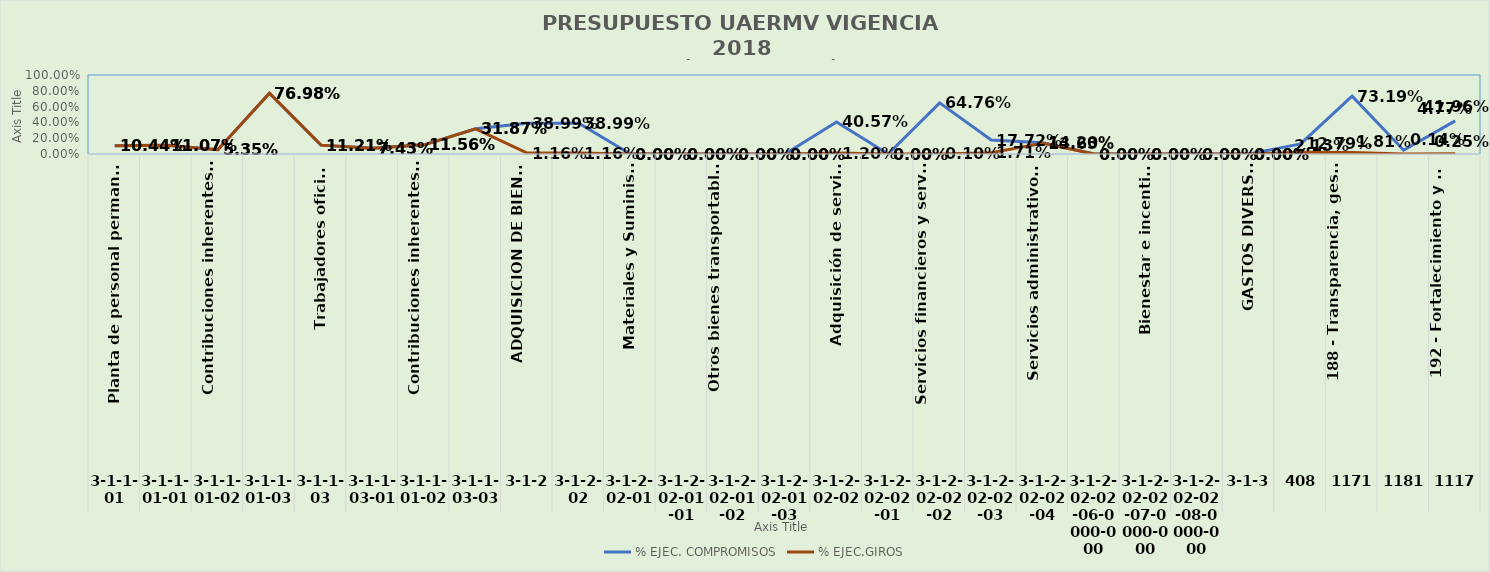
| Category | % EJEC. COMPROMISOS | % EJEC.GIROS |
|---|---|---|
| 0 | 0.104 | 0.104 |
| 1 | 0.111 | 0.111 |
| 2 | 0.053 | 0.053 |
| 3 | 0.77 | 0.77 |
| 4 | 0.112 | 0.112 |
| 5 | 0.074 | 0.074 |
| 6 | 0.116 | 0.116 |
| 7 | 0.319 | 0.319 |
| 8 | 0.39 | 0.012 |
| 9 | 0.39 | 0.012 |
| 10 | 0 | 0 |
| 11 | 0 | 0 |
| 12 | 0 | 0 |
| 13 | 0 | 0 |
| 14 | 0.406 | 0.012 |
| 15 | 0 | 0 |
| 16 | 0.648 | 0.001 |
| 17 | 0.177 | 0.017 |
| 18 | 0.142 | 0.136 |
| 19 | 0 | 0 |
| 20 | 0 | 0 |
| 21 | 0 | 0 |
| 22 | 0 | 0 |
| 23 | 0.128 | 0.021 |
| 24 | 0.732 | 0.018 |
| 25 | 0.048 | 0.001 |
| 26 | 0.42 | 0.002 |